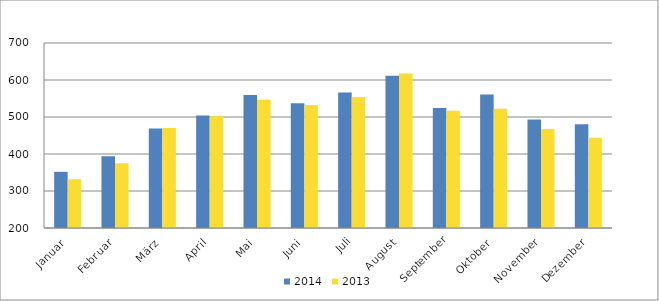
| Category | 2014 | 2013 |
|---|---|---|
| Januar | 351815 | 331867 |
| Februar | 394071 | 375091 |
| März | 469220 | 470298 |
| April | 504241 | 502181 |
| Mai | 559134 | 546849 |
| Juni | 537031 | 532095 |
| Juli | 566418 | 554141 |
| August | 611329 | 617449 |
| September | 524482 | 516764 |
| Oktober | 560625 | 522055 |
| November | 493328 | 467791 |
| Dezember | 480072 | 443733 |